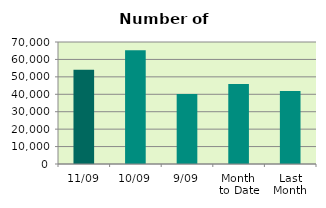
| Category | Series 0 |
|---|---|
| 11/09 | 54038 |
| 10/09 | 65296 |
| 9/09 | 40172 |
| Month 
to Date | 45892.5 |
| Last
Month | 41849.545 |